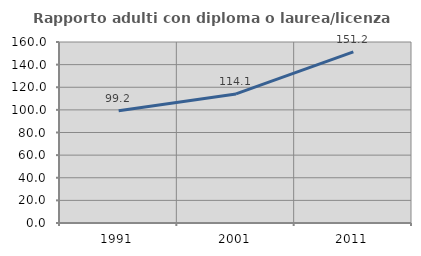
| Category | Rapporto adulti con diploma o laurea/licenza media  |
|---|---|
| 1991.0 | 99.175 |
| 2001.0 | 114.093 |
| 2011.0 | 151.2 |